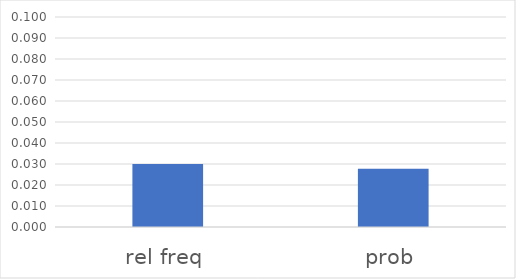
| Category | Series 0 |
|---|---|
| rel freq | 0.03 |
| prob | 0.028 |